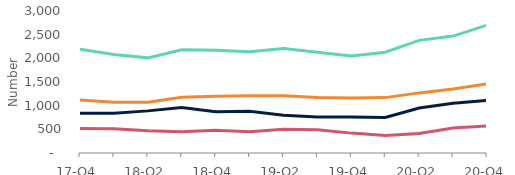
| Category | Arrears of 2.5%-5% of balance | Arrears of 5%-7.5% of balance | Arrears of 7.5%-10% of balance | Arrears over 10% of balance |
|---|---|---|---|---|
| 17-Q4 | 2190 | 840 | 520 | 1120 |
| 18-Q1 | 2080 | 840 | 510 | 1070 |
| 18-Q2 | 2010 | 890 | 470 | 1070 |
| 18-Q3 | 2180 | 960 | 450 | 1180 |
| 18-Q4 | 2170 | 870 | 480 | 1200 |
| 19-Q1 | 2140 | 880 | 450 | 1210 |
| 19-Q2 | 2210 | 800 | 500 | 1210 |
| 19-Q3 | 2130 | 760 | 490 | 1170 |
| 19-Q4 | 2050 | 760 | 420 | 1160 |
| 20-Q1 | 2130 | 750 | 370 | 1170 |
| 20-Q2 | 2380 | 950 | 410 | 1270 |
| 20-Q3 | 2470 | 1050 | 530 | 1350 |
| 20-Q4 | 2700 | 1110 | 570 | 1460 |